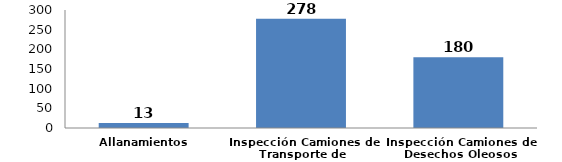
| Category | Series 0 |
|---|---|
| Allanamientos | 13 |
| Inspección Camiones de Transporte de Combustibles  | 278 |
| Inspección Camiones de Desechos Oleosos | 180 |